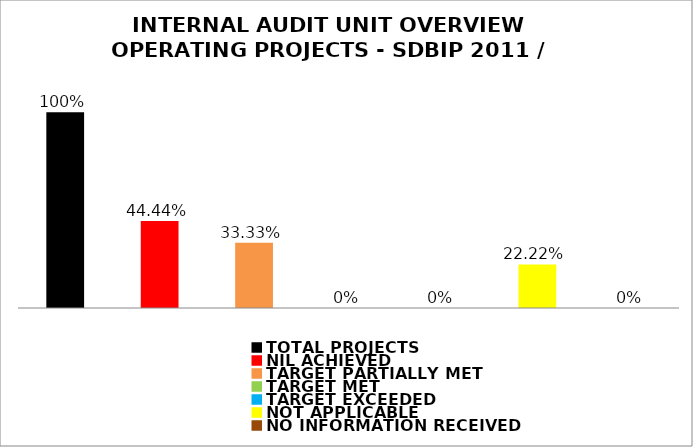
| Category | Series 0 |
|---|---|
| TOTAL PROJECTS | 1 |
| NIL ACHIEVED | 0.444 |
| TARGET PARTIALLY MET | 0.333 |
| TARGET MET | 0 |
| TARGET EXCEEDED | 0 |
| NOT APPLICABLE | 0.222 |
| NO INFORMATION RECEIVED | 0 |